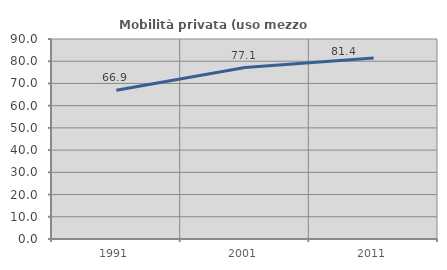
| Category | Mobilità privata (uso mezzo privato) |
|---|---|
| 1991.0 | 66.947 |
| 2001.0 | 77.139 |
| 2011.0 | 81.401 |